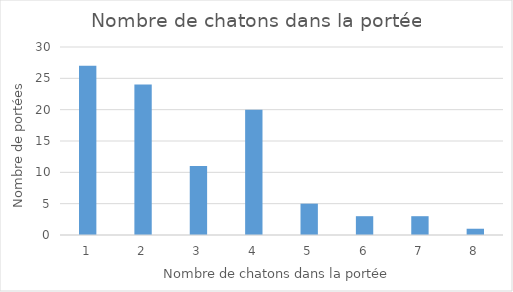
| Category | Series 0 |
|---|---|
| 1.0 | 27 |
| 2.0 | 24 |
| 3.0 | 11 |
| 4.0 | 20 |
| 5.0 | 5 |
| 6.0 | 3 |
| 7.0 | 3 |
| 8.0 | 1 |